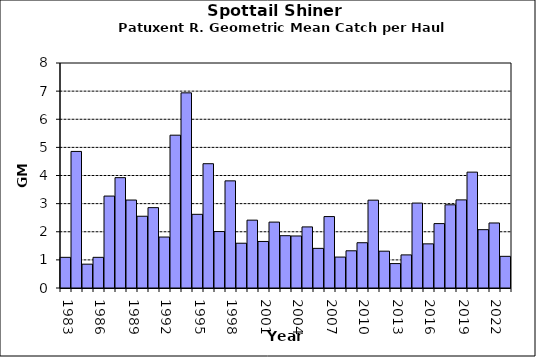
| Category | Series 0 |
|---|---|
| 1983.0 | 1.09 |
| 1984.0 | 4.856 |
| 1985.0 | 0.847 |
| 1986.0 | 1.09 |
| 1987.0 | 3.269 |
| 1988.0 | 3.923 |
| 1989.0 | 3.128 |
| 1990.0 | 2.551 |
| 1991.0 | 2.858 |
| 1992.0 | 1.812 |
| 1993.0 | 5.434 |
| 1994.0 | 6.938 |
| 1995.0 | 2.62 |
| 1996.0 | 4.419 |
| 1997.0 | 2.007 |
| 1998.0 | 3.809 |
| 1999.0 | 1.592 |
| 2000.0 | 2.413 |
| 2001.0 | 1.655 |
| 2002.0 | 2.343 |
| 2003.0 | 1.86 |
| 2004.0 | 1.85 |
| 2005.0 | 2.172 |
| 2006.0 | 1.409 |
| 2007.0 | 2.54 |
| 2008.0 | 1.1 |
| 2009.0 | 1.323 |
| 2010.0 | 1.61 |
| 2011.0 | 3.123 |
| 2012.0 | 1.309 |
| 2013.0 | 0.868 |
| 2014.0 | 1.177 |
| 2015.0 | 3.02 |
| 2016.0 | 1.57 |
| 2017.0 | 2.29 |
| 2018.0 | 2.958 |
| 2019.0 | 3.133 |
| 2020.0 | 4.12 |
| 2021.0 | 2.074 |
| 2022.0 | 2.312 |
| 2023.0 | 1.126 |